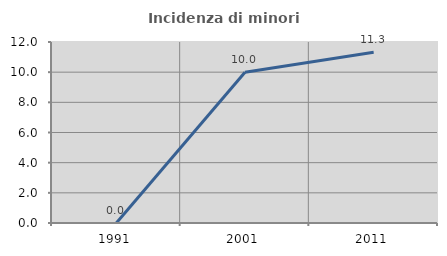
| Category | Incidenza di minori stranieri |
|---|---|
| 1991.0 | 0 |
| 2001.0 | 10 |
| 2011.0 | 11.321 |